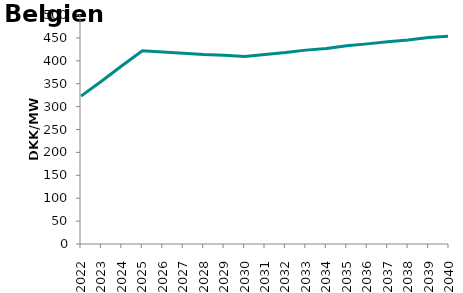
| Category | Series 2 |
|---|---|
| 2022.0 | 322.827 |
| 2023.0 | 355.299 |
| 2024.0 | 389.083 |
| 2025.0 | 422.017 |
| 2026.0 | 419.481 |
| 2027.0 | 416.625 |
| 2028.0 | 413.775 |
| 2029.0 | 412.053 |
| 2030.0 | 409.49 |
| 2031.0 | 413.804 |
| 2032.0 | 417.963 |
| 2033.0 | 423.305 |
| 2034.0 | 426.875 |
| 2035.0 | 432.802 |
| 2036.0 | 436.967 |
| 2037.0 | 441.377 |
| 2038.0 | 445.436 |
| 2039.0 | 450.929 |
| 2040.0 | 453.654 |